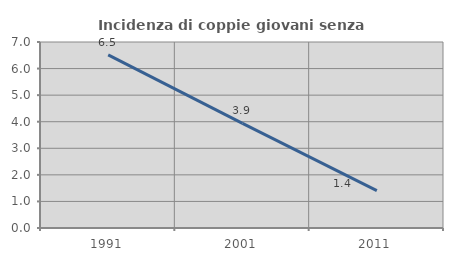
| Category | Incidenza di coppie giovani senza figli |
|---|---|
| 1991.0 | 6.516 |
| 2001.0 | 3.937 |
| 2011.0 | 1.408 |